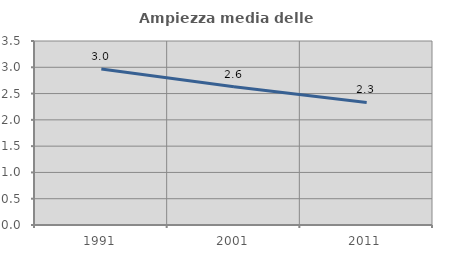
| Category | Ampiezza media delle famiglie |
|---|---|
| 1991.0 | 2.966 |
| 2001.0 | 2.628 |
| 2011.0 | 2.331 |